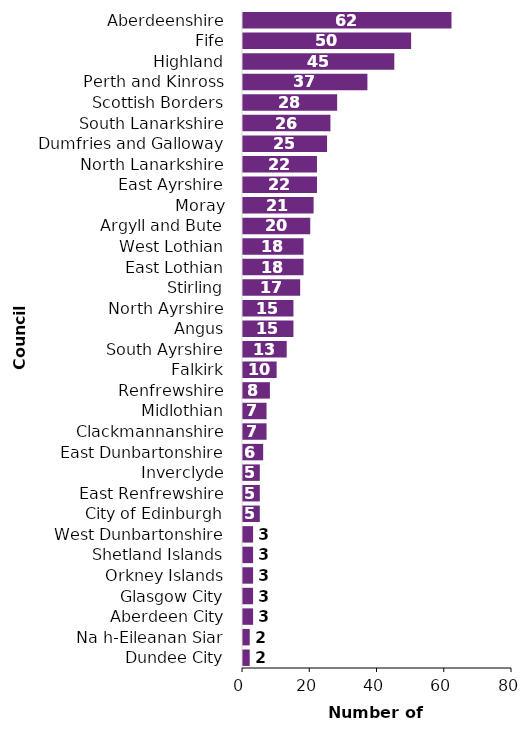
| Category | Number of settlements
[Note 2] |
|---|---|
| Dundee City | 2 |
| Na h-Eileanan Siar | 2 |
| Aberdeen City | 3 |
| Glasgow City | 3 |
| Orkney Islands | 3 |
| Shetland Islands | 3 |
| West Dunbartonshire | 3 |
| City of Edinburgh | 5 |
| East Renfrewshire | 5 |
| Inverclyde | 5 |
| East Dunbartonshire | 6 |
| Clackmannanshire | 7 |
| Midlothian | 7 |
| Renfrewshire | 8 |
| Falkirk | 10 |
| South Ayrshire | 13 |
| Angus | 15 |
| North Ayrshire | 15 |
| Stirling | 17 |
| East Lothian | 18 |
| West Lothian | 18 |
| Argyll and Bute | 20 |
| Moray | 21 |
| East Ayrshire | 22 |
| North Lanarkshire | 22 |
| Dumfries and Galloway | 25 |
| South Lanarkshire | 26 |
| Scottish Borders | 28 |
| Perth and Kinross | 37 |
| Highland | 45 |
| Fife | 50 |
| Aberdeenshire | 62 |